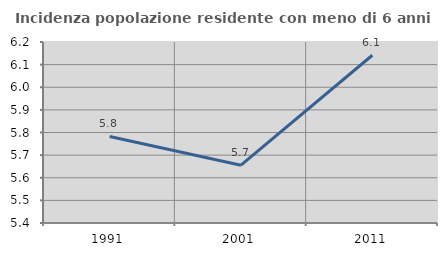
| Category | Incidenza popolazione residente con meno di 6 anni |
|---|---|
| 1991.0 | 5.783 |
| 2001.0 | 5.656 |
| 2011.0 | 6.141 |